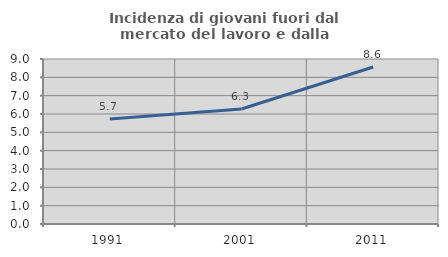
| Category | Incidenza di giovani fuori dal mercato del lavoro e dalla formazione  |
|---|---|
| 1991.0 | 5.721 |
| 2001.0 | 6.273 |
| 2011.0 | 8.562 |